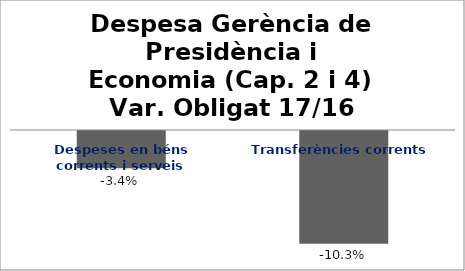
| Category | Series 0 |
|---|---|
| Despeses en béns corrents i serveis | -0.034 |
| Transferències corrents | -0.103 |